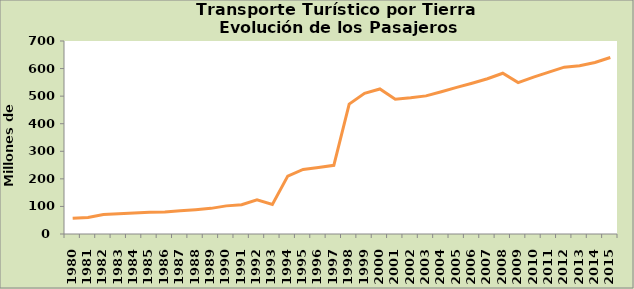
| Category | Series 0 |
|---|---|
| 1980.0 | 57 |
| 1981.0 | 60 |
| 1982.0 | 71 |
| 1983.0 | 73 |
| 1984.0 | 76 |
| 1985.0 | 79 |
| 1986.0 | 80 |
| 1987.0 | 84 |
| 1988.0 | 88 |
| 1989.0 | 93 |
| 1990.0 | 102 |
| 1991.0 | 106 |
| 1992.0 | 124 |
| 1993.0 | 107 |
| 1994.0 | 210 |
| 1995.0 | 234 |
| 1996.0 | 241 |
| 1997.0 | 249 |
| 1998.0 | 471 |
| 1999.0 | 510 |
| 2000.0 | 526 |
| 2001.0 | 489 |
| 2002.0 | 494 |
| 2003.0 | 501 |
| 2004.0 | 516 |
| 2005.0 | 532 |
| 2006.0 | 547 |
| 2007.0 | 563 |
| 2008.0 | 583 |
| 2009.0 | 549 |
| 2010.0 | 569 |
| 2011.0 | 587 |
| 2012.0 | 605 |
| 2013.0 | 610 |
| 2014.0 | 622.205 |
| 2015.0 | 640 |